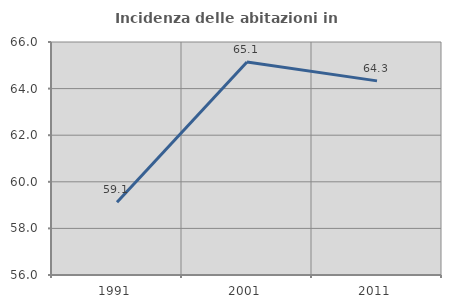
| Category | Incidenza delle abitazioni in proprietà  |
|---|---|
| 1991.0 | 59.123 |
| 2001.0 | 65.139 |
| 2011.0 | 64.331 |